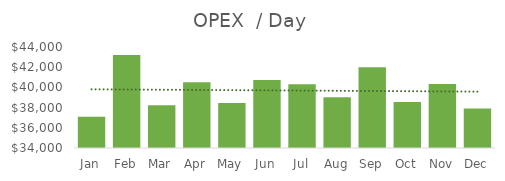
| Category | Operating Cost per Day |
|---|---|
| Jan | 37096.774 |
| Feb | 43214.286 |
| Mar | 38225.806 |
| Apr | 40500 |
| May | 38451.613 |
| Jun | 40733.333 |
| Jul | 40322.581 |
| Aug | 39032.258 |
| Sep | 42000 |
| Oct | 38548.387 |
| Nov | 40333.333 |
| Dec | 37903.226 |